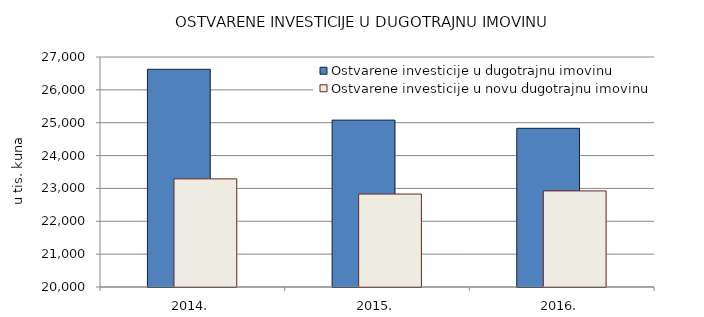
| Category | Ostvarene investicije u dugotrajnu imovinu | Ostvarene investicije u novu dugotrajnu imovinu |
|---|---|---|
| 2014. | 26626 | 23291 |
| 2015. | 25079 | 22829 |
| 2016. | 24830 | 22925 |